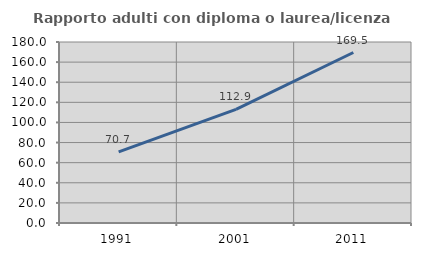
| Category | Rapporto adulti con diploma o laurea/licenza media  |
|---|---|
| 1991.0 | 70.704 |
| 2001.0 | 112.921 |
| 2011.0 | 169.54 |